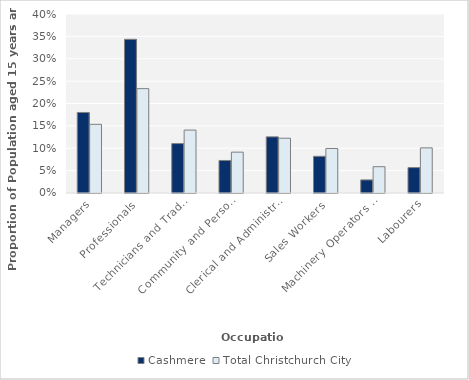
| Category | Cashmere | Total Christchurch City |
|---|---|---|
| Managers | 0.18 | 0.153 |
| Professionals | 0.343 | 0.233 |
| Technicians and Trades Workers | 0.11 | 0.141 |
| Community and Personal Service Workers | 0.073 | 0.091 |
| Clerical and Administrative Workers | 0.125 | 0.122 |
| Sales Workers | 0.082 | 0.099 |
| Machinery Operators and Drivers | 0.029 | 0.059 |
| Labourers | 0.057 | 0.101 |